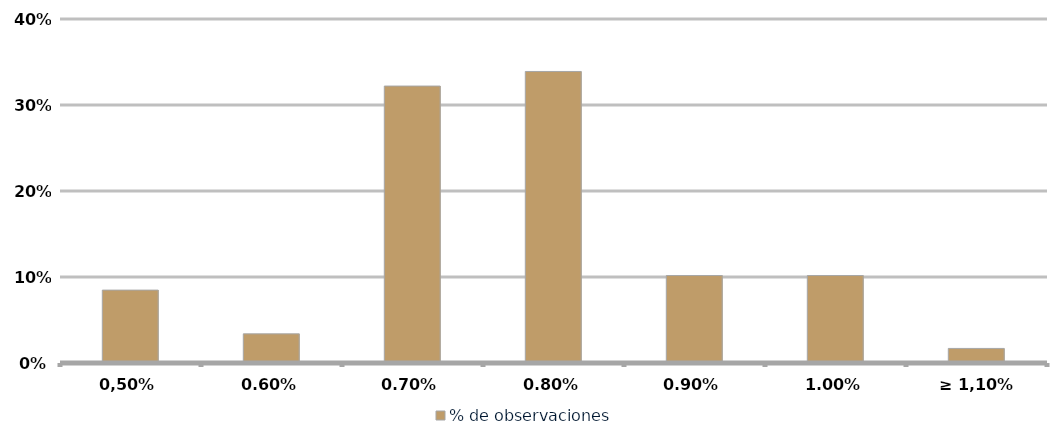
| Category | % de observaciones  |
|---|---|
| 0,50% | 0.085 |
| 0,60% | 0.034 |
| 0,70% | 0.322 |
| 0,80% | 0.339 |
| 0,90% | 0.102 |
| 1,00% | 0.102 |
| ≥ 1,10% | 0.017 |